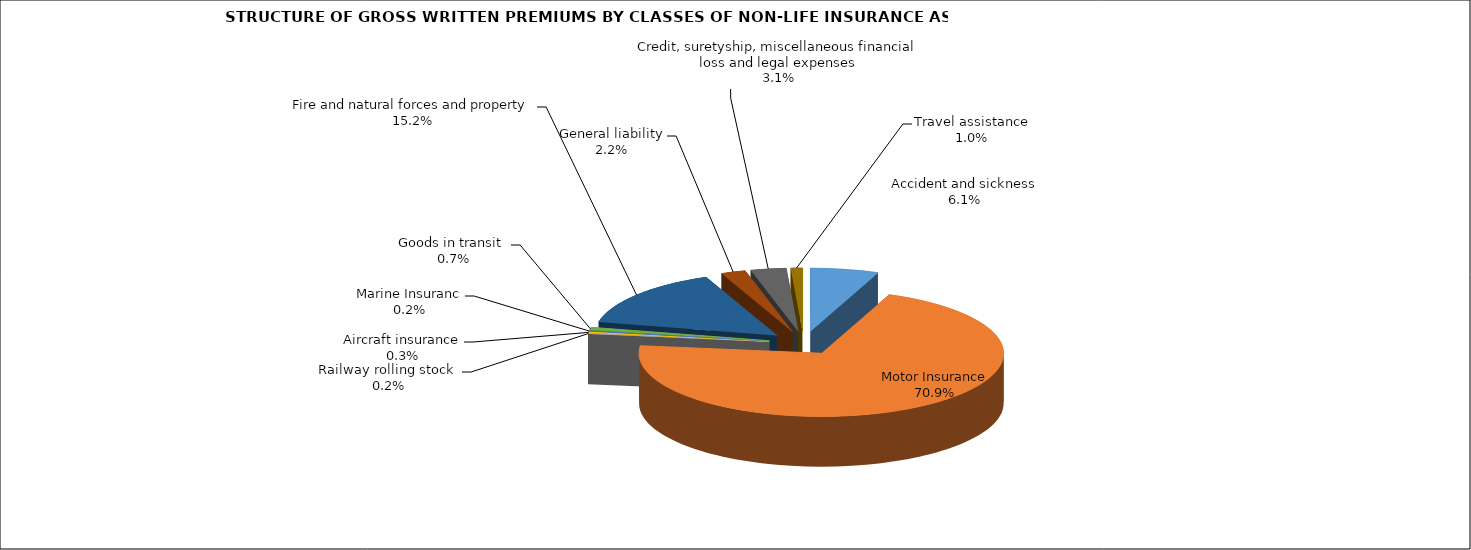
| Category | Accident and sickness |
|---|---|
| Accident and sickness | 0.061 |
| Motor Insurance | 0.709 |
| Railway rolling stock  | 0.002 |
| Aircraft insurance | 0.003 |
| Marine Insuranc | 0.002 |
| Goods in transit  | 0.007 |
| Fire and natural forces and property | 0.152 |
| General liability | 0.022 |
| Credit, suretyship, miscellaneous financial loss and legal expenses | 0.031 |
| Travel assistance | 0.01 |